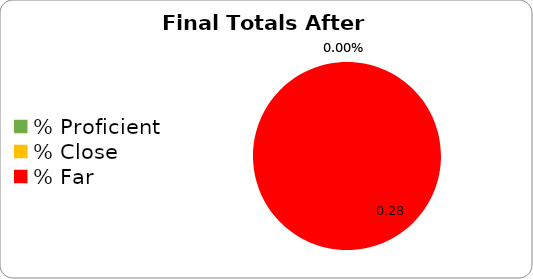
| Category | Series 0 |
|---|---|
| % Proficient | 0 |
| % Close | 0 |
| % Far | 0.28 |